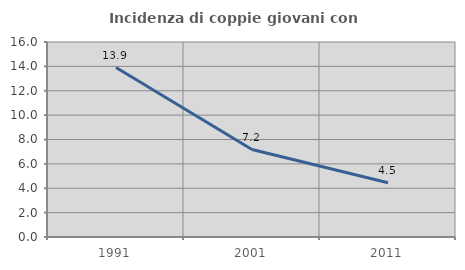
| Category | Incidenza di coppie giovani con figli |
|---|---|
| 1991.0 | 13.901 |
| 2001.0 | 7.177 |
| 2011.0 | 4.455 |